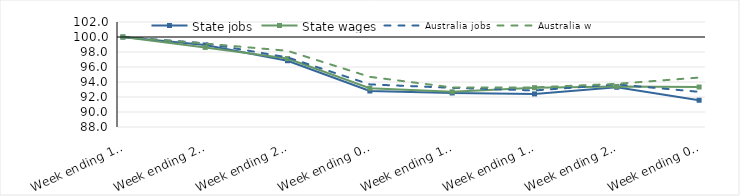
| Category | State jobs | State wages | Australia jobs | Australia wages |
|---|---|---|---|---|
| 2020-03-14 | 100 | 100 | 100 | 100 |
| 2020-03-21 | 98.942 | 98.615 | 99.165 | 99.123 |
| 2020-03-28 | 96.837 | 97.126 | 97.282 | 98.156 |
| 2020-04-04 | 92.798 | 93.164 | 93.679 | 94.686 |
| 2020-04-11 | 92.535 | 92.695 | 93.222 | 93.277 |
| 2020-04-18 | 92.409 | 93.241 | 92.871 | 93.281 |
| 2020-04-25 | 93.295 | 93.415 | 93.679 | 93.754 |
| 2020-05-02 | 91.569 | 93.33 | 92.686 | 94.591 |